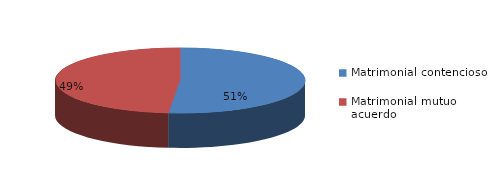
| Category | Series 0 |
|---|---|
| 0 | 429 |
| 1 | 405 |